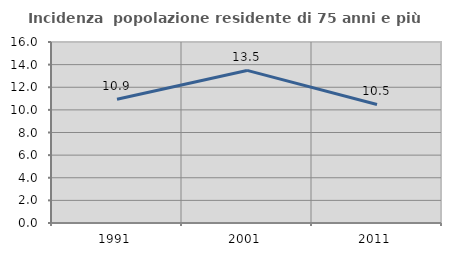
| Category | Incidenza  popolazione residente di 75 anni e più |
|---|---|
| 1991.0 | 10.939 |
| 2001.0 | 13.488 |
| 2011.0 | 10.481 |